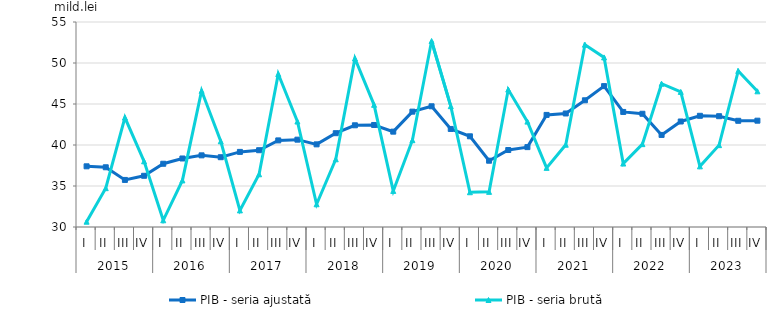
| Category | PIB - seria ajustată | PIB - seria brută |
|---|---|---|
| 0 | 37.399 | 30.647 |
| 1 | 37.284 | 34.736 |
| 2 | 35.741 | 43.347 |
| 3 | 36.246 | 38.011 |
| 4 | 37.713 | 30.82 |
| 5 | 38.356 | 35.681 |
| 6 | 38.737 | 46.605 |
| 7 | 38.51 | 40.451 |
| 8 | 39.158 | 32.024 |
| 9 | 39.364 | 36.429 |
| 10 | 40.561 | 48.654 |
| 11 | 40.65 | 42.863 |
| 12 | 40.078 | 32.776 |
| 13 | 41.441 | 38.257 |
| 14 | 42.404 | 50.555 |
| 15 | 42.443 | 44.902 |
| 16 | 41.628 | 34.401 |
| 17 | 44.068 | 40.587 |
| 18 | 44.72 | 52.682 |
| 19 | 41.958 | 44.734 |
| 20 | 41.06 | 34.239 |
| 21 | 38.083 | 34.285 |
| 22 | 39.387 | 46.761 |
| 23 | 39.742 | 42.851 |
| 24 | 43.67 | 37.212 |
| 25 | 43.845 | 40.034 |
| 26 | 45.452 | 52.235 |
| 27 | 47.182 | 50.682 |
| 28 | 44.032 | 37.738 |
| 29 | 43.809 | 40.105 |
| 30 | 41.228 | 47.472 |
| 31 | 42.867 | 46.475 |
| 32 | 43.561 | 37.396 |
| 33 | 43.513 | 39.984 |
| 34 | 42.953 | 49.033 |
| 35 | 42.965 | 46.546 |